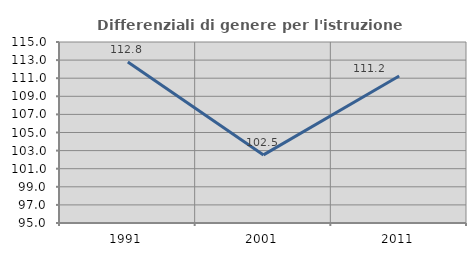
| Category | Differenziali di genere per l'istruzione superiore |
|---|---|
| 1991.0 | 112.783 |
| 2001.0 | 102.526 |
| 2011.0 | 111.248 |